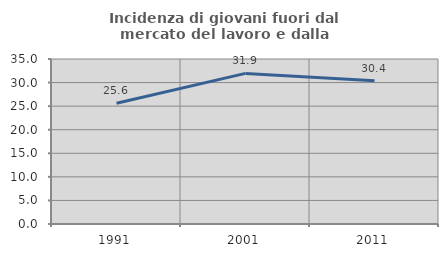
| Category | Incidenza di giovani fuori dal mercato del lavoro e dalla formazione  |
|---|---|
| 1991.0 | 25.612 |
| 2001.0 | 31.947 |
| 2011.0 | 30.396 |